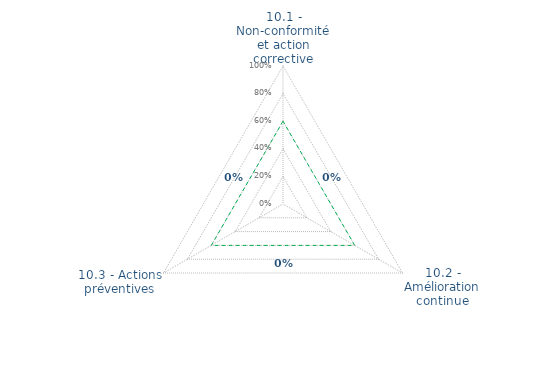
| Category | Art. 10 | limite de CONFORMITÉ |
|---|---|---|
| 10.1 - Non-conformité et action corrective | 0 | 0.6 |
| 10.2 - Amélioration continue | 0 | 0.6 |
| 10.3 - Actions préventives | 0 | 0.6 |